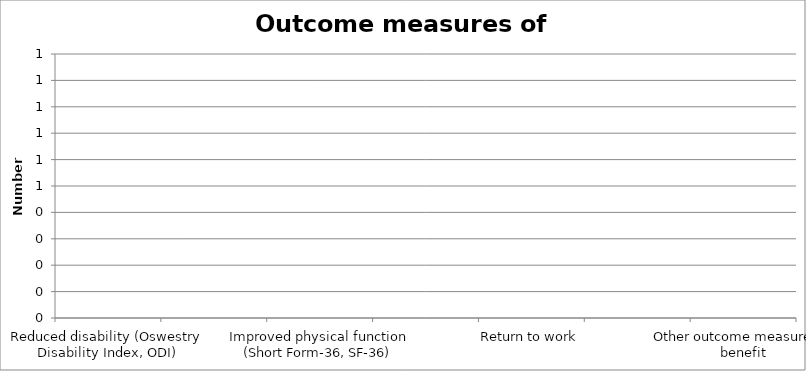
| Category | Series 0 |
|---|---|
| Reduced disability (Oswestry Disability Index, ODI) | 0 |
| Reduced pain (Visual analogue scale, VAS) | 0 |
| Improved physical function (Short Form-36, SF-36) | 0 |
| Improved quality of life (SF-36 or EQ-5D) | 0 |
| Return to work | 0 |
| No subsequent procedures were needed | 0 |
| Other outcome measure of benefit | 0 |